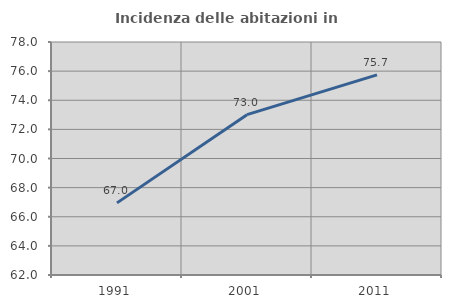
| Category | Incidenza delle abitazioni in proprietà  |
|---|---|
| 1991.0 | 66.953 |
| 2001.0 | 73.009 |
| 2011.0 | 75.745 |